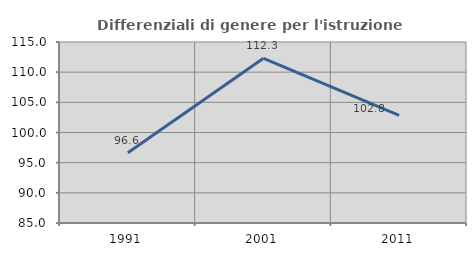
| Category | Differenziali di genere per l'istruzione superiore |
|---|---|
| 1991.0 | 96.629 |
| 2001.0 | 112.29 |
| 2011.0 | 102.831 |